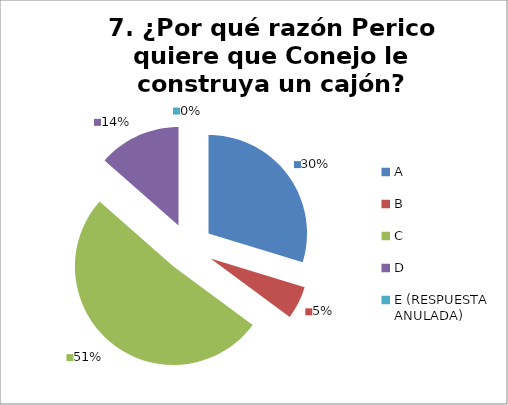
| Category | CANTIDAD DE RESPUESTAS PREGUNTA (7) | PORCENTAJE |
|---|---|---|
| A | 11 | 0.297 |
| B | 2 | 0.054 |
| C | 19 | 0.514 |
| D | 5 | 0.135 |
| E (RESPUESTA ANULADA) | 0 | 0 |